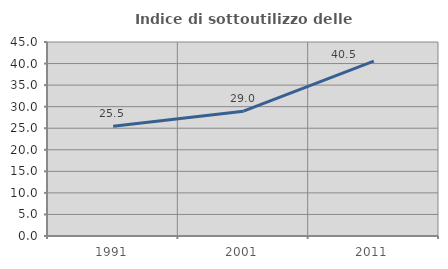
| Category | Indice di sottoutilizzo delle abitazioni  |
|---|---|
| 1991.0 | 25.46 |
| 2001.0 | 28.963 |
| 2011.0 | 40.549 |